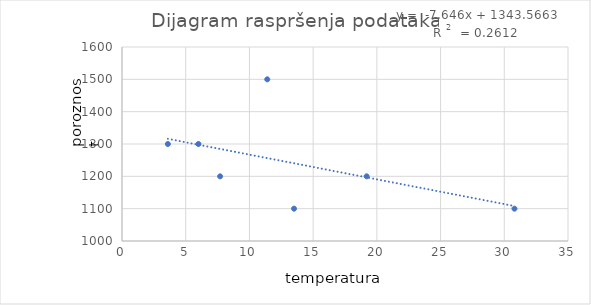
| Category | poroznost |
|---|---|
| 30.8 | 1100 |
| 19.2 | 1200 |
| 6.0 | 1300 |
| 13.5 | 1100 |
| 11.4 | 1500 |
| 7.7 | 1200 |
| 3.6 | 1300 |